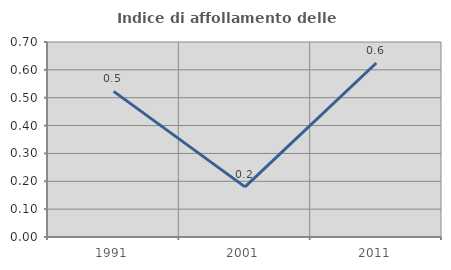
| Category | Indice di affollamento delle abitazioni  |
|---|---|
| 1991.0 | 0.523 |
| 2001.0 | 0.18 |
| 2011.0 | 0.625 |